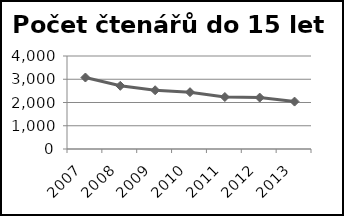
| Category | Počet čtenářů do 15 let |
|---|---|
| 2007.0 | 3074 |
| 2008.0 | 2718 |
| 2009.0 | 2527 |
| 2010.0 | 2444 |
| 2011.0 | 2236 |
| 2012.0 | 2212 |
| 2013.0 | 2039 |